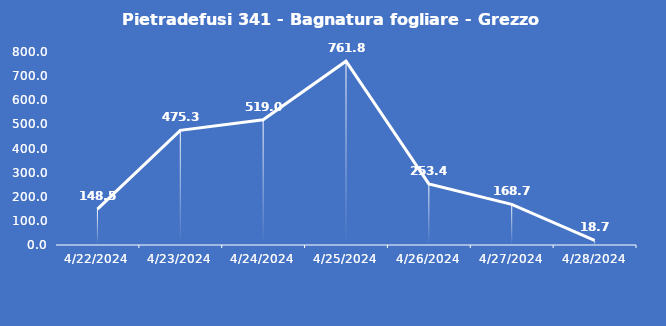
| Category | Pietradefusi 341 - Bagnatura fogliare - Grezzo (min) |
|---|---|
| 4/22/24 | 148.5 |
| 4/23/24 | 475.3 |
| 4/24/24 | 519 |
| 4/25/24 | 761.8 |
| 4/26/24 | 253.4 |
| 4/27/24 | 168.7 |
| 4/28/24 | 18.7 |